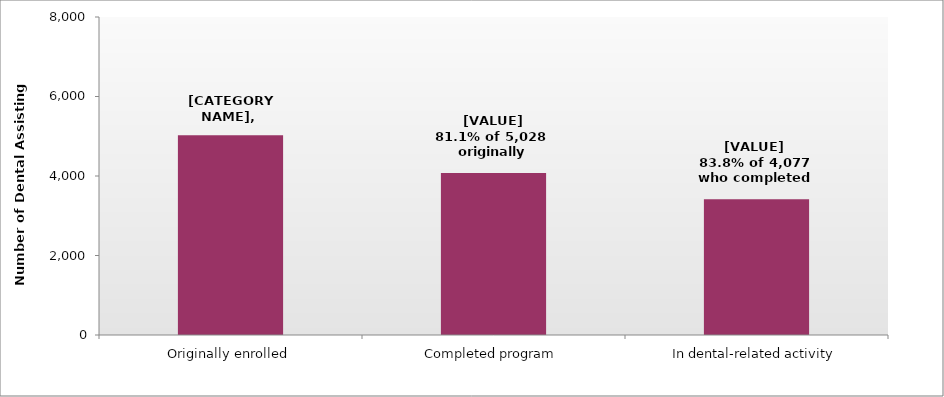
| Category | Series 0 |
|---|---|
| Originally enrolled | 5028 |
| Completed program | 4077 |
| In dental-related activity | 3416 |